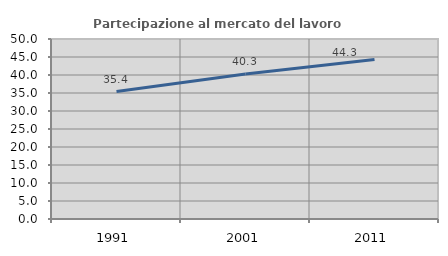
| Category | Partecipazione al mercato del lavoro  femminile |
|---|---|
| 1991.0 | 35.416 |
| 2001.0 | 40.293 |
| 2011.0 | 44.301 |